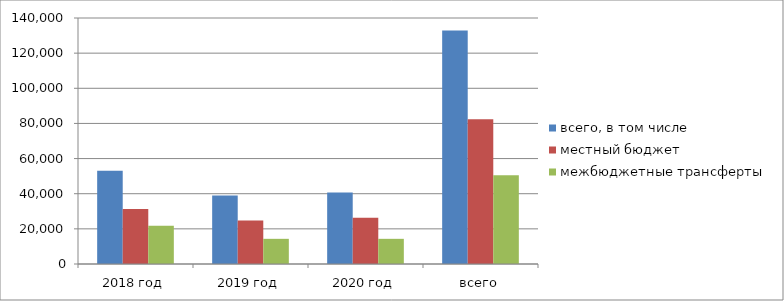
| Category | всего, в том числе | местный бюджет | межбюджетные трансферты |
|---|---|---|---|
| 2018 год | 53103.528 | 31267 | 21836.528 |
| 2019 год | 39052.077 | 24730 | 14322.077 |
| 2020 год | 40672.077 | 26350 | 14322.077 |
| всего | 132827.683 | 82347 | 50480.683 |